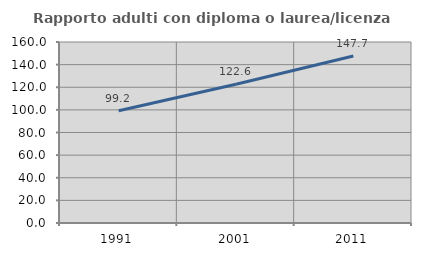
| Category | Rapporto adulti con diploma o laurea/licenza media  |
|---|---|
| 1991.0 | 99.229 |
| 2001.0 | 122.615 |
| 2011.0 | 147.683 |